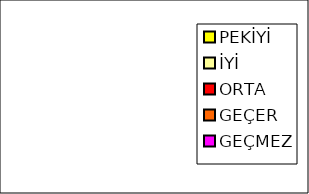
| Category | Series 0 |
|---|---|
| PEKİYİ | 0 |
| İYİ | 0 |
| ORTA | 0 |
| GEÇER | 0 |
| GEÇMEZ | 0 |